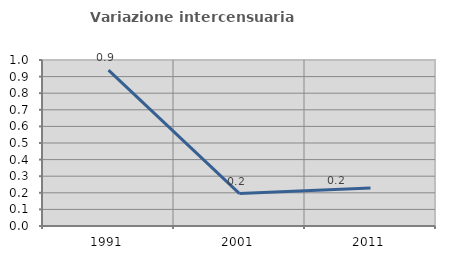
| Category | Variazione intercensuaria annua |
|---|---|
| 1991.0 | 0.939 |
| 2001.0 | 0.195 |
| 2011.0 | 0.23 |